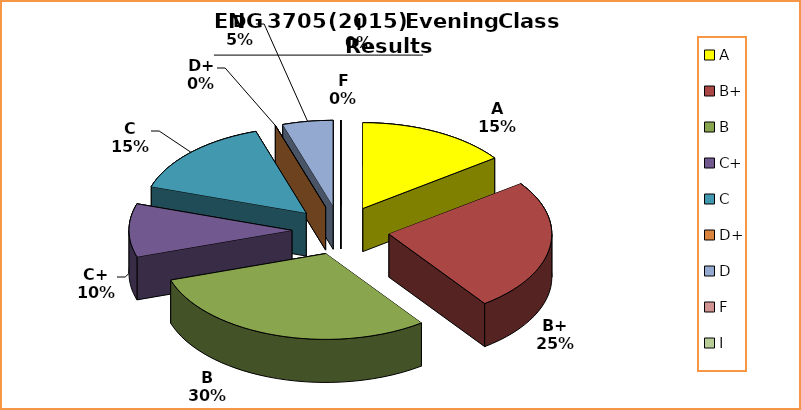
| Category | Series 0 |
|---|---|
| A | 3 |
| B+ | 5 |
| B | 6 |
| C+ | 2 |
| C | 3 |
| D+ | 0 |
| D | 1 |
| F | 0 |
| I | 0 |